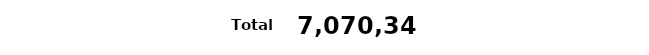
| Category | Total Migrants |
|---|---|
| Total Migrants | 7070345 |